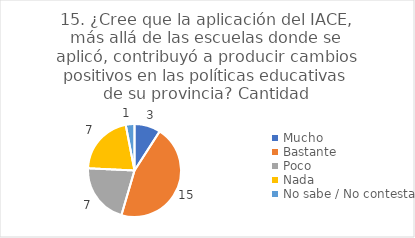
| Category | 15. ¿Cree que la aplicación del IACE, más allá de las escuelas donde se aplicó, contribuyó a producir cambios positivos en las políticas educativas de su provincia? |
|---|---|
| Mucho  | 0.091 |
| Bastante  | 0.455 |
| Poco  | 0.212 |
| Nada  | 0.212 |
| No sabe / No contesta | 0.03 |